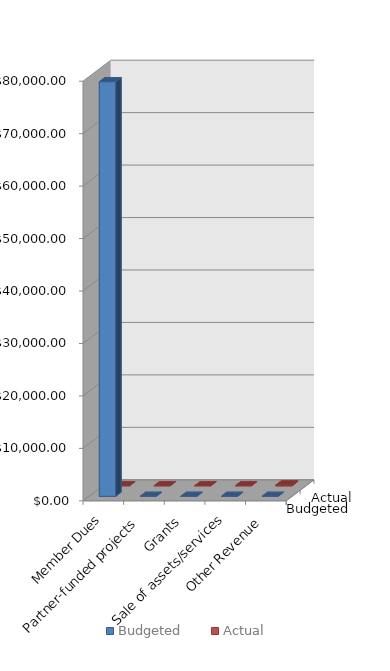
| Category | Budgeted | Actual |
|---|---|---|
| Member Dues | 79060 | 0 |
| Partner-funded projects | 0 | 0 |
| Grants | 0 | 0 |
| Sale of assets/services | 0 | 0 |
| Other Revenue | 0 | 161.95 |